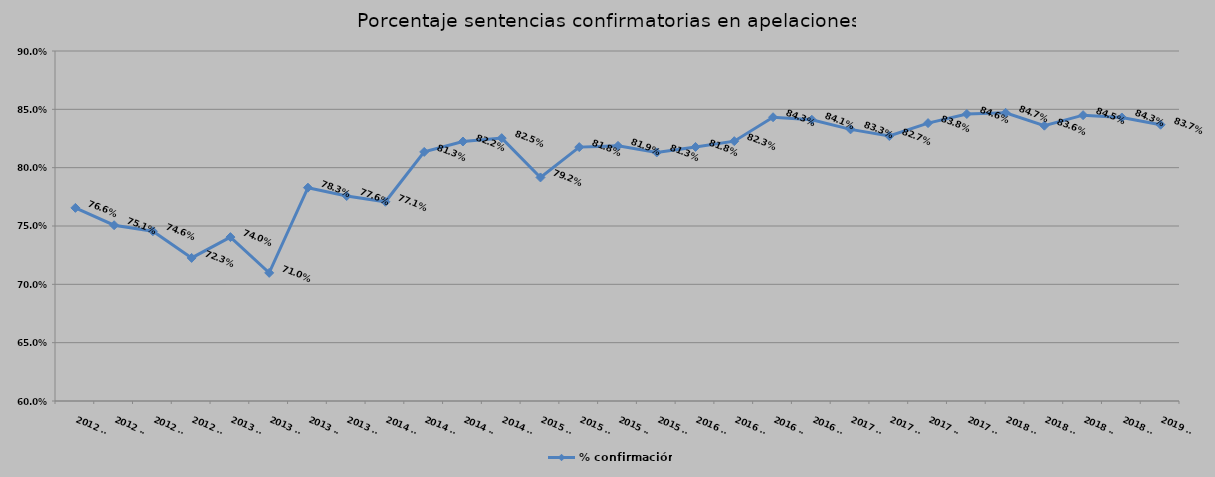
| Category | % confirmación |
|---|---|
| 2012 T1 | 0.766 |
| 2012 T2 | 0.751 |
| 2012 T3 | 0.746 |
| 2012 T4 | 0.723 |
| 2013 T1 | 0.74 |
| 2013 T2 | 0.71 |
| 2013 T3 | 0.783 |
| 2013 T4 | 0.776 |
| 2014 T1 | 0.771 |
| 2014 T2 | 0.813 |
| 2014 T3 | 0.822 |
| 2014 T4 | 0.825 |
| 2015 T1 | 0.792 |
| 2015 T2 | 0.818 |
| 2015 T3 | 0.819 |
| 2015 T4 | 0.813 |
| 2016 T1 | 0.818 |
| 2016 T2 | 0.823 |
| 2016 T3 | 0.843 |
| 2016 T4 | 0.841 |
| 2017 T1 | 0.833 |
| 2017 T2 | 0.827 |
| 2017 T3 | 0.838 |
| 2017 T4 | 0.846 |
| 2018 T1 | 0.847 |
| 2018 T2 | 0.836 |
| 2018 T3 | 0.845 |
| 2018 T4 | 0.843 |
| 2019 T1 | 0.837 |